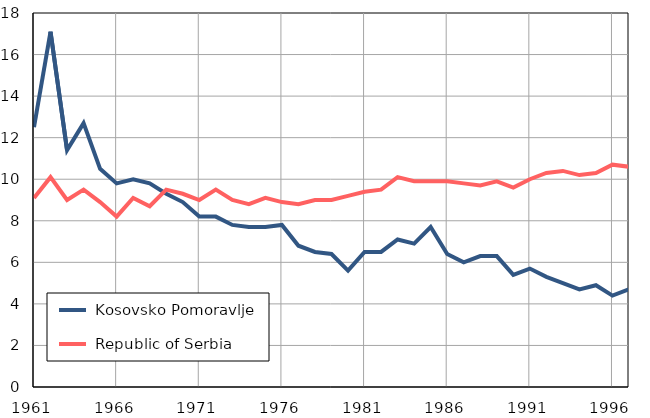
| Category |  Kosovsko Pomoravlje |  Republic of Serbia |
|---|---|---|
| 1961.0 | 12.5 | 9.1 |
| 1962.0 | 17.1 | 10.1 |
| 1963.0 | 11.4 | 9 |
| 1964.0 | 12.7 | 9.5 |
| 1965.0 | 10.5 | 8.9 |
| 1966.0 | 9.8 | 8.2 |
| 1967.0 | 10 | 9.1 |
| 1968.0 | 9.8 | 8.7 |
| 1969.0 | 9.3 | 9.5 |
| 1970.0 | 8.9 | 9.3 |
| 1971.0 | 8.2 | 9 |
| 1972.0 | 8.2 | 9.5 |
| 1973.0 | 7.8 | 9 |
| 1974.0 | 7.7 | 8.8 |
| 1975.0 | 7.7 | 9.1 |
| 1976.0 | 7.8 | 8.9 |
| 1977.0 | 6.8 | 8.8 |
| 1978.0 | 6.5 | 9 |
| 1979.0 | 6.4 | 9 |
| 1980.0 | 5.6 | 9.2 |
| 1981.0 | 6.5 | 9.4 |
| 1982.0 | 6.5 | 9.5 |
| 1983.0 | 7.1 | 10.1 |
| 1984.0 | 6.9 | 9.9 |
| 1985.0 | 7.7 | 9.9 |
| 1986.0 | 6.4 | 9.9 |
| 1987.0 | 6 | 9.8 |
| 1988.0 | 6.3 | 9.7 |
| 1989.0 | 6.3 | 9.9 |
| 1990.0 | 5.4 | 9.6 |
| 1991.0 | 5.7 | 10 |
| 1992.0 | 5.3 | 10.3 |
| 1993.0 | 5 | 10.4 |
| 1994.0 | 4.7 | 10.2 |
| 1995.0 | 4.9 | 10.3 |
| 1996.0 | 4.4 | 10.7 |
| 1997.0 | 4.7 | 10.6 |